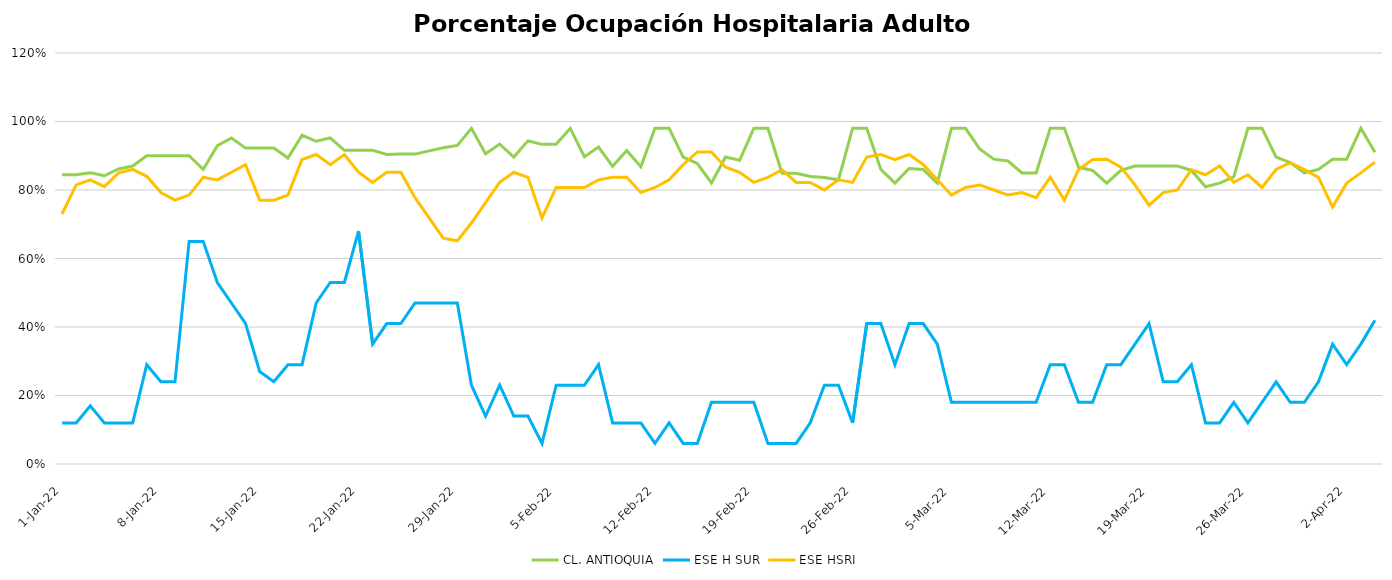
| Category | CL. ANTIOQUIA | ESE H SUR | ESE HSRI |
|---|---|---|---|
| 2022-01-01 | 0.845 | 0.12 | 0.73 |
| 2022-01-02 | 0.845 | 0.12 | 0.815 |
| 2022-01-03 | 0.85 | 0.17 | 0.83 |
| 2022-01-04 | 0.842 | 0.12 | 0.81 |
| 2022-01-05 | 0.861 | 0.12 | 0.85 |
| 2022-01-06 | 0.87 | 0.12 | 0.86 |
| 2022-01-07 | 0.9 | 0.29 | 0.84 |
| 2022-01-08 | 0.9 | 0.24 | 0.793 |
| 2022-01-09 | 0.9 | 0.24 | 0.77 |
| 2022-01-10 | 0.9 | 0.65 | 0.785 |
| 2022-01-11 | 0.86 | 0.65 | 0.837 |
| 2022-01-12 | 0.929 | 0.53 | 0.83 |
| 2022-01-13 | 0.952 | 0.47 | 0.852 |
| 2022-01-14 | 0.922 | 0.41 | 0.874 |
| 2022-01-15 | 0.922 | 0.27 | 0.77 |
| 2022-01-16 | 0.922 | 0.24 | 0.77 |
| 2022-01-17 | 0.893 | 0.29 | 0.785 |
| 2022-01-18 | 0.96 | 0.29 | 0.889 |
| 2022-01-19 | 0.942 | 0.47 | 0.904 |
| 2022-01-20 | 0.952 | 0.53 | 0.874 |
| 2022-01-21 | 0.916 | 0.53 | 0.904 |
| 2022-01-22 | 0.916 | 0.68 | 0.852 |
| 2022-01-23 | 0.916 | 0.35 | 0.822 |
| 2022-01-24 | 0.904 | 0.41 | 0.852 |
| 2022-01-25 | 0.905 | 0.41 | 0.852 |
| 2022-01-26 | 0.905 | 0.47 | 0.778 |
| 2022-01-27 | 0.914 | 0.47 | 0.719 |
| 2022-01-28 | 0.923 | 0.47 | 0.659 |
| 2022-01-29 | 0.93 | 0.47 | 0.652 |
| 2022-01-30 | 0.98 | 0.23 | 0.704 |
| 2022-01-31 | 0.906 | 0.14 | 0.763 |
| 2022-02-01 | 0.934 | 0.23 | 0.822 |
| 2022-02-02 | 0.896 | 0.14 | 0.852 |
| 2022-02-03 | 0.943 | 0.14 | 0.837 |
| 2022-02-04 | 0.933 | 0.06 | 0.719 |
| 2022-02-05 | 0.933 | 0.23 | 0.807 |
| 2022-02-06 | 0.98 | 0.23 | 0.807 |
| 2022-02-07 | 0.897 | 0.23 | 0.807 |
| 2022-02-08 | 0.925 | 0.29 | 0.83 |
| 2022-02-09 | 0.869 | 0.12 | 0.837 |
| 2022-02-10 | 0.915 | 0.12 | 0.837 |
| 2022-02-11 | 0.868 | 0.12 | 0.793 |
| 2022-02-12 | 0.98 | 0.06 | 0.807 |
| 2022-02-13 | 0.98 | 0.12 | 0.83 |
| 2022-02-14 | 0.896 | 0.06 | 0.874 |
| 2022-02-15 | 0.877 | 0.06 | 0.911 |
| 2022-02-16 | 0.821 | 0.18 | 0.911 |
| 2022-02-17 | 0.896 | 0.18 | 0.867 |
| 2022-02-18 | 0.887 | 0.18 | 0.852 |
| 2022-02-19 | 0.98 | 0.18 | 0.822 |
| 2022-02-20 | 0.98 | 0.06 | 0.837 |
| 2022-02-21 | 0.849 | 0.06 | 0.859 |
| 2022-02-22 | 0.849 | 0.06 | 0.822 |
| 2022-02-23 | 0.84 | 0.12 | 0.822 |
| 2022-02-24 | 0.837 | 0.23 | 0.8 |
| 2022-02-25 | 0.83 | 0.23 | 0.83 |
| 2022-02-26 | 0.98 | 0.12 | 0.822 |
| 2022-02-27 | 0.98 | 0.41 | 0.896 |
| 2022-02-28 | 0.86 | 0.41 | 0.904 |
| 2022-03-01 | 0.82 | 0.29 | 0.889 |
| 2022-03-02 | 0.863 | 0.41 | 0.904 |
| 2022-03-03 | 0.86 | 0.41 | 0.874 |
| 2022-03-04 | 0.82 | 0.35 | 0.83 |
| 2022-03-05 | 0.98 | 0.18 | 0.785 |
| 2022-03-06 | 0.98 | 0.18 | 0.807 |
| 2022-03-07 | 0.92 | 0.18 | 0.815 |
| 2022-03-08 | 0.89 | 0.18 | 0.8 |
| 2022-03-09 | 0.885 | 0.18 | 0.785 |
| 2022-03-10 | 0.85 | 0.18 | 0.793 |
| 2022-03-11 | 0.85 | 0.18 | 0.778 |
| 2022-03-12 | 0.98 | 0.29 | 0.837 |
| 2022-03-13 | 0.98 | 0.29 | 0.77 |
| 2022-03-14 | 0.867 | 0.18 | 0.859 |
| 2022-03-15 | 0.857 | 0.18 | 0.889 |
| 2022-03-16 | 0.82 | 0.29 | 0.89 |
| 2022-03-17 | 0.857 | 0.29 | 0.867 |
| 2022-03-18 | 0.87 | 0.35 | 0.815 |
| 2022-03-19 | 0.87 | 0.41 | 0.756 |
| 2022-03-20 | 0.87 | 0.24 | 0.793 |
| 2022-03-21 | 0.87 | 0.24 | 0.8 |
| 2022-03-22 | 0.857 | 0.29 | 0.859 |
| 2022-03-23 | 0.81 | 0.12 | 0.844 |
| 2022-03-24 | 0.82 | 0.12 | 0.87 |
| 2022-03-25 | 0.838 | 0.18 | 0.822 |
| 2022-03-26 | 0.98 | 0.12 | 0.844 |
| 2022-03-27 | 0.98 | 0.18 | 0.807 |
| 2022-03-28 | 0.896 | 0.24 | 0.86 |
| 2022-03-29 | 0.88 | 0.18 | 0.88 |
| 2022-03-30 | 0.85 | 0.18 | 0.859 |
| 2022-03-31 | 0.86 | 0.24 | 0.837 |
| 2022-04-01 | 0.89 | 0.35 | 0.75 |
| 2022-04-02 | 0.89 | 0.29 | 0.82 |
| 2022-04-03 | 0.98 | 0.35 | 0.85 |
| 2022-04-04 | 0.91 | 0.42 | 0.881 |